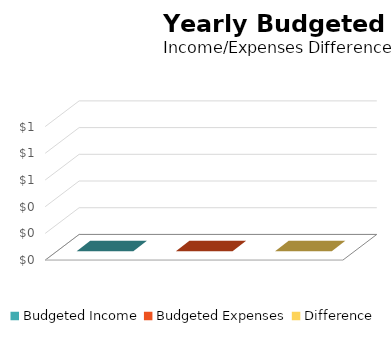
| Category | Series 0 |
|---|---|
| Budgeted Income | 0 |
| Budgeted Expenses | 0 |
| Difference | 0 |